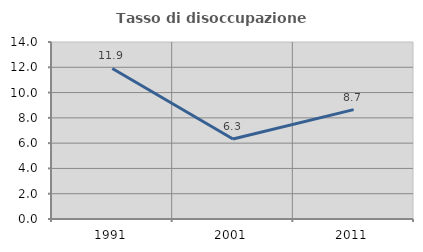
| Category | Tasso di disoccupazione giovanile  |
|---|---|
| 1991.0 | 11.905 |
| 2001.0 | 6.329 |
| 2011.0 | 8.654 |